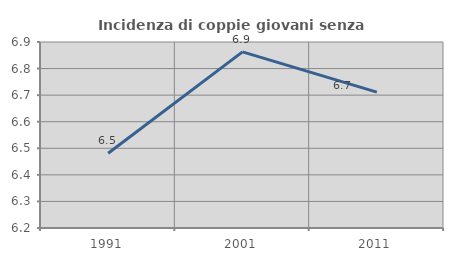
| Category | Incidenza di coppie giovani senza figli |
|---|---|
| 1991.0 | 6.481 |
| 2001.0 | 6.863 |
| 2011.0 | 6.711 |